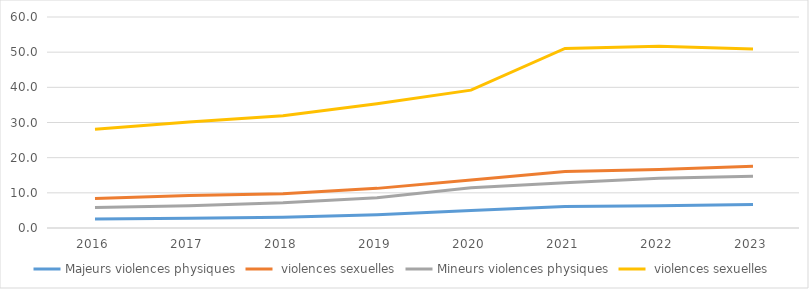
| Category | Majeurs | Mineurs |
|---|---|---|
| 2016.0 | 8.362 | 28.088 |
| 2017.0 | 9.227 | 30.148 |
| 2018.0 | 9.721 | 31.89 |
| 2019.0 | 11.269 | 35.347 |
| 2020.0 | 13.661 | 39.206 |
| 2021.0 | 16.035 | 51.064 |
| 2022.0 | 16.608 | 51.655 |
| 2023.0 | 17.586 | 50.928 |